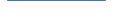
| Category | Series 0 |
|---|---|
| 0 | 26 |
| 1 | 19 |
| 2 | 19 |
| 3 | 20 |
| 4 | 27 |
| 5 | 31 |
| 6 | 26 |
| 7 | 23 |
| 8 | 21 |